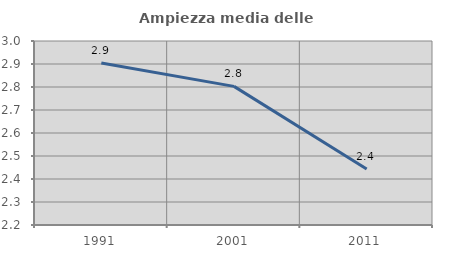
| Category | Ampiezza media delle famiglie |
|---|---|
| 1991.0 | 2.905 |
| 2001.0 | 2.803 |
| 2011.0 | 2.443 |